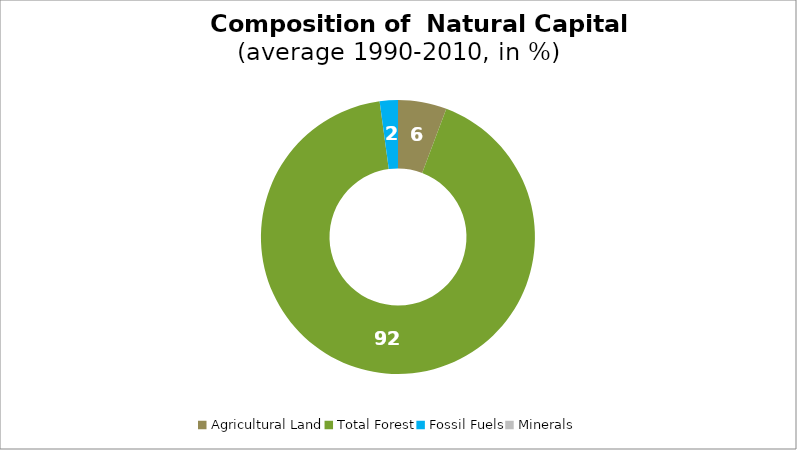
| Category | Series 0 |
|---|---|
| Agricultural Land | 5.738 |
| Total Forest | 92.116 |
| Fossil Fuels | 2.145 |
| Minerals | 0 |